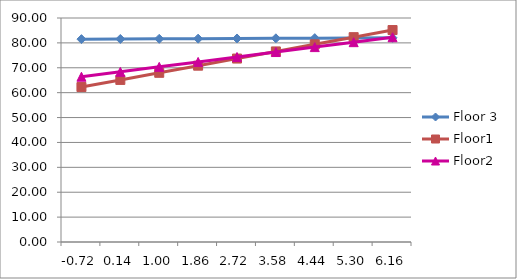
| Category | Floor 3 | Floor1 | Floor2 |
|---|---|---|---|
| -0.7239999999999998 | 81.511 | 62.252 | 66.401 |
| 0.13600000000000012 | 81.576 | 65.116 | 68.385 |
| 0.9960000000000002 | 81.641 | 67.979 | 70.369 |
| 1.8560000000000003 | 81.707 | 70.843 | 72.353 |
| 2.716 | 81.772 | 73.707 | 74.337 |
| 3.576 | 81.837 | 76.571 | 76.321 |
| 4.436 | 81.903 | 79.435 | 78.305 |
| 5.296 | 81.968 | 82.298 | 80.289 |
| 6.156000000000001 | 82.033 | 85.162 | 82.273 |